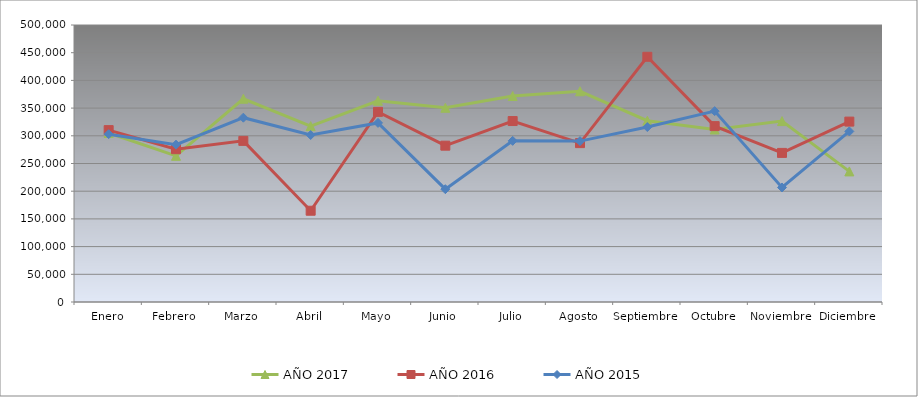
| Category | AÑO 2017 | AÑO 2016 | AÑO 2015 |
|---|---|---|---|
| Enero | 305030 | 310270 | 302960 |
| Febrero | 263860 | 275820 | 284040 |
| Marzo | 366850 | 290820 | 332720 |
| Abril | 317490 | 164740 | 301400 |
| Mayo | 363300 | 343190 | 323280 |
| Junio | 350560 | 282180 | 203640 |
| Julio | 371830 | 326650 | 290880 |
| Agosto | 380360 | 286790 | 290400 |
| Septiembre | 327300 | 442630 | 315760 |
| Octubre | 311300 | 317480 | 344560 |
| Noviembre | 326550 | 269130 | 206720 |
| Diciembre | 235720 | 325620 | 307910 |